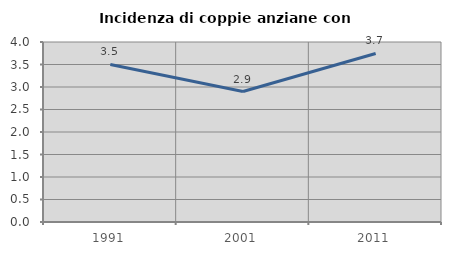
| Category | Incidenza di coppie anziane con figli |
|---|---|
| 1991.0 | 3.501 |
| 2001.0 | 2.899 |
| 2011.0 | 3.744 |